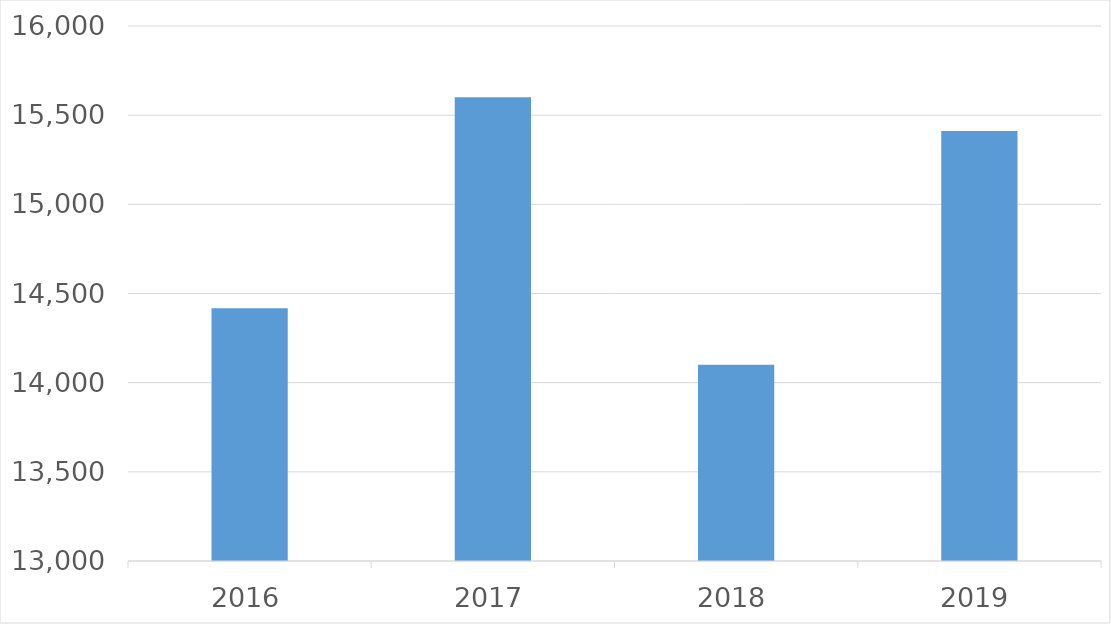
| Category | Series 0 |
|---|---|
| 2016 | 14417 |
| 2017 | 15601 |
| 2018 | 14100 |
| 2019 | 15411 |